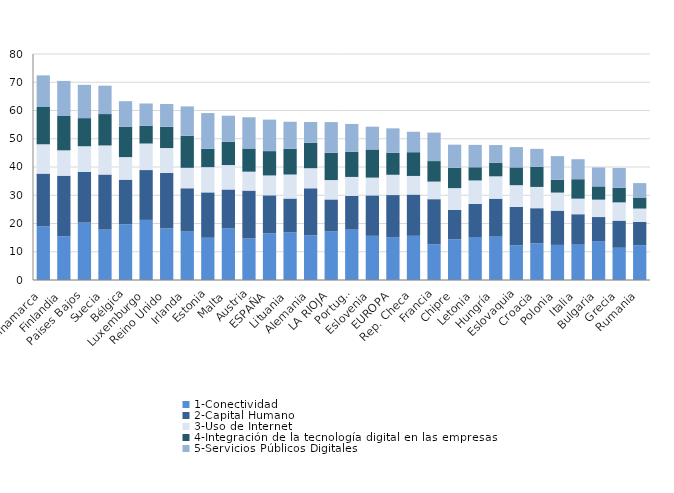
| Category | 1-Conectividad | 2-Capital Humano | 3-Uso de Internet | 4-Integración de la tecnología digital en las empresas | 5-Servicios Públicos Digitales |
|---|---|---|---|---|---|
| Dinamarca | 19.048 | 18.618 | 10.378 | 13.194 | 11.2 |
| Finlandia | 15.495 | 21.428 | 8.974 | 12.164 | 12.41 |
| Paises Bajos | 20.3 | 17.998 | 9.05 | 9.95 | 11.778 |
| Suecia | 17.835 | 19.505 | 10.287 | 11.112 | 10.052 |
| Bélgica | 19.705 | 15.81 | 7.99 | 10.788 | 9.003 |
| Luxemburgo | 21.27 | 17.648 | 9.393 | 6.304 | 7.868 |
| Reino Unido | 18.29 | 19.622 | 8.792 | 7.524 | 8.074 |
| Irlanda | 17.14 | 15.335 | 7.24 | 11.348 | 10.388 |
| Estonia | 14.958 | 16.062 | 8.924 | 6.508 | 12.648 |
| Malta | 18.365 | 13.68 | 8.643 | 8.262 | 9.207 |
| Austria | 14.695 | 16.962 | 6.69 | 8.2 | 11.05 |
| ESPAÑA | 16.572 | 13.405 | 7.029 | 8.616 | 11.144 |
| Lituania | 16.828 | 12.008 | 8.502 | 9.138 | 9.544 |
| Alemania | 15.845 | 16.622 | 7.104 | 9.008 | 7.353 |
| LA RIOJA | 17.18 | 11.335 | 6.861 | 9.664 | 10.848 |
| Portugal | 17.825 | 11.955 | 6.705 | 8.922 | 9.834 |
| Eslovenia | 15.64 | 14.31 | 6.289 | 9.972 | 8.067 |
| EUROPA | 15.18 | 14.89 | 7.173 | 7.752 | 8.682 |
| Rep. Checa | 15.645 | 14.602 | 6.584 | 8.404 | 7.242 |
| Francia | 12.615 | 15.992 | 6.226 | 7.26 | 10.088 |
| Chipre | 14.43 | 10.418 | 7.678 | 7.188 | 8.194 |
| Letonia | 15.228 | 11.708 | 8.3 | 4.674 | 7.93 |
| Hungría | 15.34 | 13.442 | 7.914 | 4.834 | 6.243 |
| Eslovaquia | 12.3 | 13.558 | 7.707 | 6.294 | 7.191 |
| Croacia | 12.972 | 12.442 | 7.528 | 7.146 | 6.342 |
| Polonia | 12.422 | 12.125 | 6.396 | 4.488 | 8.424 |
| Italia | 12.502 | 10.78 | 5.509 | 6.884 | 7.076 |
| Bulgaria | 13.772 | 8.515 | 6.151 | 4.696 | 6.705 |
| Grecia | 11.41 | 9.608 | 6.459 | 5.166 | 7.028 |
| Rumania | 12.28 | 8.305 | 4.704 | 3.9 | 5.114 |